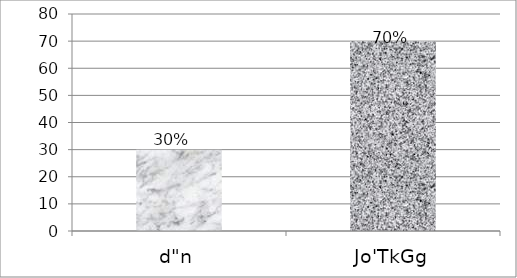
| Category | Series 0 |
|---|---|
| d"n | 30 |
| Jo'TkGg | 70 |